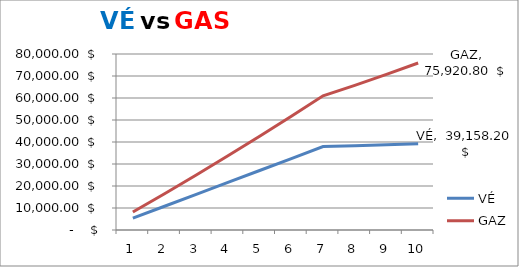
| Category | VÉ | GAZ |
|---|---|---|
| 0 | 5390.1 | 8168.44 |
| 1 | 10789.06 | 16504.88 |
| 2 | 16197.17 | 25017.72 |
| 3 | 21614.73 | 33715.78 |
| 4 | 27042.055 | 42608.321 |
| 5 | 32479.468 | 51705.067 |
| 6 | 37927.31 | 61016.228 |
| 7 | 38326.332 | 65744.086 |
| 8 | 38736.5 | 70708.336 |
| 9 | 39158.196 | 75920.799 |